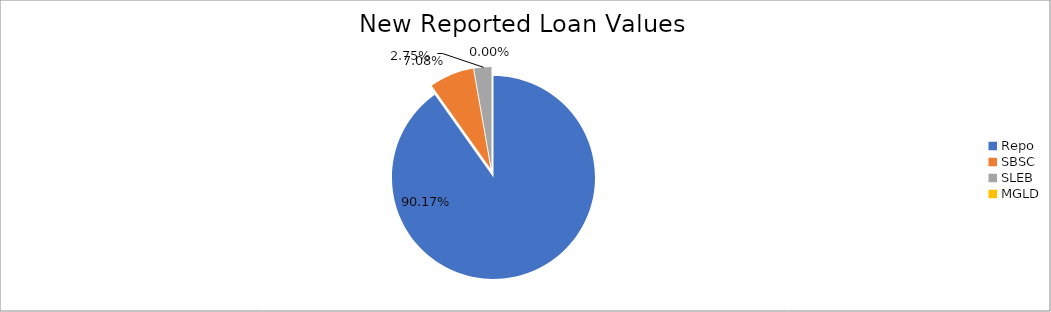
| Category | Series 0 |
|---|---|
| Repo | 12374856.641 |
| SBSC | 972016.721 |
| SLEB | 376986.334 |
| MGLD | 203.406 |